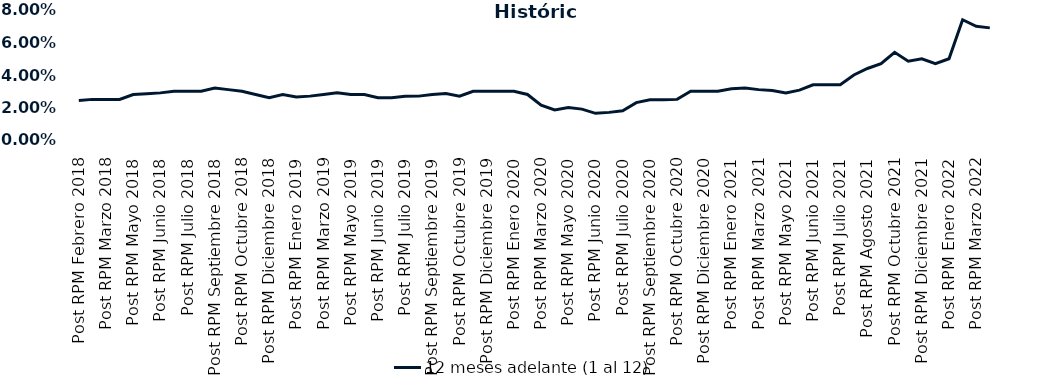
| Category | 12 meses adelante (1 al 12)  |
|---|---|
| Post RPM Febrero 2018 | 0.024 |
| Pre RPM Marzo 2018 | 0.025 |
| Post RPM Marzo 2018 | 0.025 |
| Pre RPM Mayo 2018 | 0.025 |
| Post RPM Mayo 2018 | 0.028 |
| Pre RPM Junio 2018 | 0.028 |
| Post RPM Junio 2018 | 0.029 |
| Pre RPM Julio 2018 | 0.03 |
| Post RPM Julio 2018 | 0.03 |
| Pre RPM Septiembre 2018 | 0.03 |
| Post RPM Septiembre 2018 | 0.032 |
| Pre RPM Octubre 2018 | 0.031 |
| Post RPM Octubre 2018 | 0.03 |
| Pre RPM Diciembre 2018 | 0.028 |
| Post RPM Diciembre 2018 | 0.026 |
| Pre RPM Enero 2019 | 0.028 |
| Post RPM Enero 2019 | 0.026 |
| Pre RPM Marzo 2019 | 0.027 |
| Post RPM Marzo 2019 | 0.028 |
| Pre RPM Mayo 2019 | 0.029 |
| Post RPM Mayo 2019 | 0.028 |
| Pre RPM Junio 2019 | 0.028 |
| Post RPM Junio 2019 | 0.026 |
| Pre RPM Julio 2019 | 0.026 |
| Post RPM Julio 2019 | 0.027 |
| Pre RPM Septiembre 2019 | 0.027 |
| Post RPM Septiembre 2019 | 0.028 |
| Pre RPM Octubre 2019 | 0.029 |
| Post RPM Octubre 2019 | 0.027 |
| Pre RPM Diciembre 2019 | 0.03 |
| Post RPM Diciembre 2019 | 0.03 |
| Pre RPM Enero 2020 | 0.03 |
| Post RPM Enero 2020 | 0.03 |
| Pre RPM Marzo 2020 | 0.028 |
| Post RPM Marzo 2020 | 0.022 |
| Pre RPM Mayo 2020 | 0.018 |
| Post RPM Mayo 2020 | 0.02 |
| Pre RPM Junio 2020 | 0.019 |
| Post RPM Junio 2020 | 0.016 |
| Pre RPM Julio 2020 | 0.017 |
| Post RPM Julio 2020 | 0.018 |
| Pre RPM Septiembre 2020 | 0.023 |
| Post RPM Septiembre 2020 | 0.025 |
| Pre RPM Octubre 2020 | 0.025 |
| Post RPM Octubre 2020 | 0.025 |
| Pre RPM Diciembre 2020 | 0.03 |
| Post RPM Diciembre 2020 | 0.03 |
| Pre RPM Enero 2021 | 0.03 |
| Post RPM Enero 2021 | 0.032 |
| Pre RPM Marzo 2021 | 0.032 |
| Post RPM Marzo 2021 | 0.031 |
| Pre RPM Mayo 2021 | 0.03 |
| Post RPM Mayo 2021 | 0.029 |
| Pre RPM Junio 2021 | 0.031 |
| Post RPM Junio 2021 | 0.034 |
| Pre RPM Julio 2021 | 0.034 |
| Post RPM Julio 2021 | 0.034 |
| Pre RPM Agosto 2021 | 0.04 |
| Post RPM Agosto 2021 | 0.044 |
| Pre RPM Octubre 2021 | 0.047 |
| Post RPM Octubre 2021 | 0.054 |
| Pre RPM Diciembre 2021 | 0.048 |
| Post RPM Diciembre 2021 | 0.05 |
| Pre RPM Enero 2022 | 0.047 |
| Post RPM Enero 2022 | 0.05 |
| Pre RPM Marzo 2022 | 0.074 |
| Post RPM Marzo 2022 | 0.07 |
| Pre RPM Mayo 2022 | 0.069 |